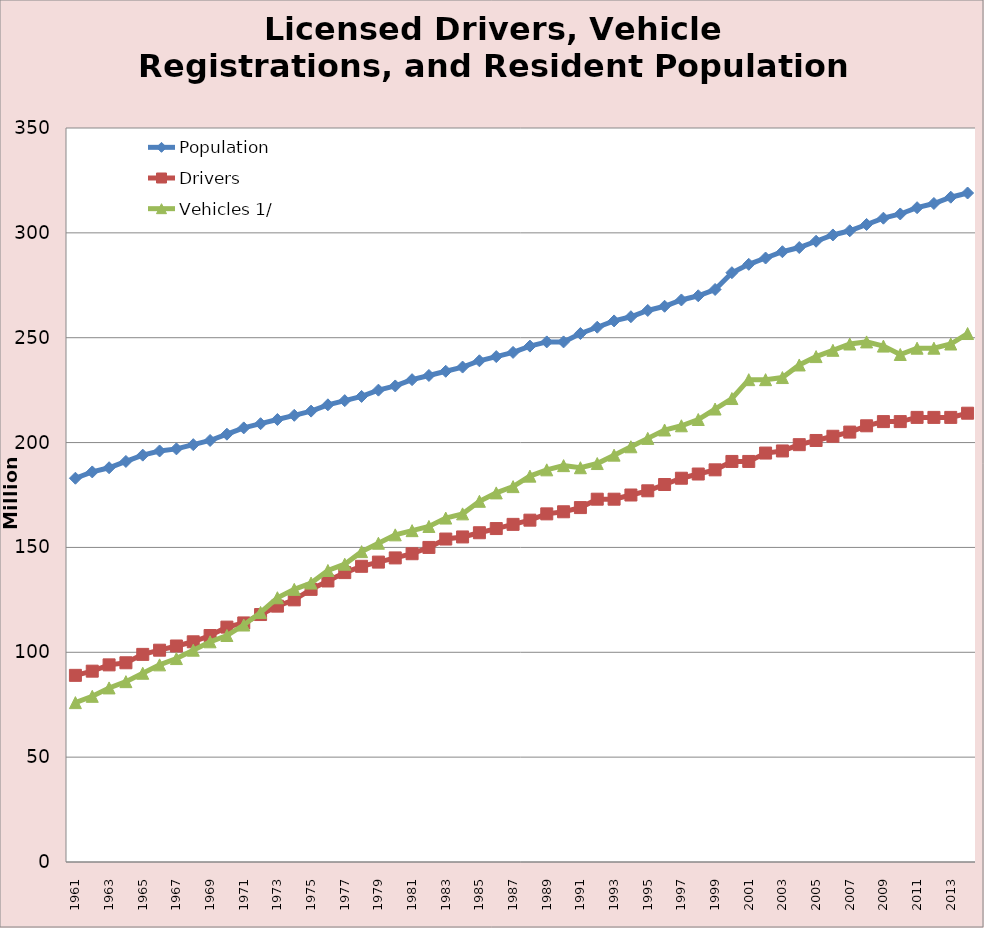
| Category | Population | Drivers  | Vehicles 1/ |
|---|---|---|---|
| 1961 | 183 | 89 | 76 |
| 1962 | 186 | 91 | 79 |
| 1963 | 188 | 94 | 83 |
| 1964 | 191 | 95 | 86 |
| 1965 | 194 | 99 | 90 |
| 1966 | 196 | 101 | 94 |
| 1967 | 197 | 103 | 97 |
| 1968 | 199 | 105 | 101 |
| 1969 | 201 | 108 | 105 |
| 1970 | 204 | 112 | 108 |
| 1971 | 207 | 114 | 113 |
| 1972 | 209 | 118 | 119 |
| 1973 | 211 | 122 | 126 |
| 1974 | 213 | 125 | 130 |
| 1975 | 215 | 130 | 133 |
| 1976 | 218 | 134 | 139 |
| 1977 | 220 | 138 | 142 |
| 1978 | 222 | 141 | 148 |
| 1979 | 225 | 143 | 152 |
| 1980 | 227 | 145 | 156 |
| 1981 | 230 | 147 | 158 |
| 1982 | 232 | 150 | 160 |
| 1983 | 234 | 154 | 164 |
| 1984 | 236 | 155 | 166 |
| 1985 | 239 | 157 | 172 |
| 1986 | 241 | 159 | 176 |
| 1987 | 243 | 161 | 179 |
| 1988 | 246 | 163 | 184 |
| 1989 | 248 | 166 | 187 |
| 1990 | 248 | 167 | 189 |
| 1991 | 252 | 169 | 188 |
| 1992 | 255 | 173 | 190 |
| 1993 | 258 | 173 | 194 |
| 1994 | 260 | 175 | 198 |
| 1995 | 263 | 177 | 202 |
| 1996 | 265 | 180 | 206 |
| 1997 | 268 | 183 | 208 |
| 1998 | 270 | 185 | 211 |
| 1999 | 273 | 187 | 216 |
| 2000 | 281 | 191 | 221 |
| 2001 | 285 | 191 | 230 |
| 2002 | 288 | 195 | 230 |
| 2003 | 291 | 196 | 231 |
| 2004 | 293 | 199 | 237 |
| 2005 | 296 | 201 | 241 |
| 2006 | 299 | 203 | 244 |
| 2007 | 301 | 205 | 247 |
| 2008 | 304 | 208 | 248 |
| 2009 | 307 | 210 | 246 |
| 2010 | 309 | 210 | 242 |
| 2011 | 312 | 212 | 245 |
| 2012 | 314 | 212 | 245 |
| 2013 | 317 | 212 | 247 |
| 2014 | 319 | 214 | 252 |